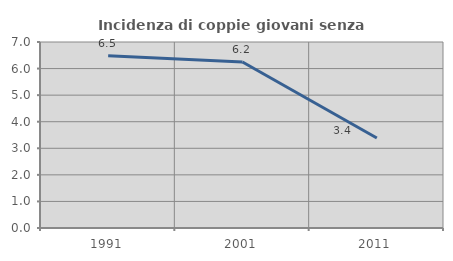
| Category | Incidenza di coppie giovani senza figli |
|---|---|
| 1991.0 | 6.482 |
| 2001.0 | 6.246 |
| 2011.0 | 3.389 |